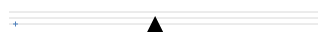
| Category | Series 0 |
|---|---|
| -6.5 | 0 |
| -3.5 | 0 |
| 6.5 | 0 |